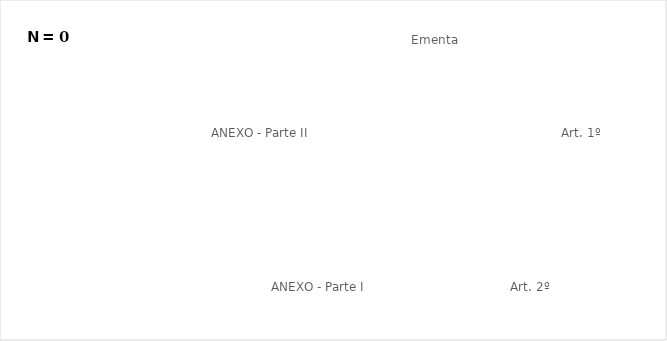
| Category | Series 0 |
|---|---|
| Ementa  | 0 |
| Art. 1º  | 0 |
| Art. 2º  | 0 |
| ANEXO - Parte I  | 0 |
| ANEXO - Parte II  | 0 |